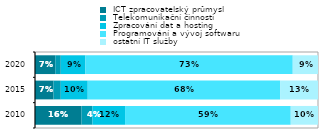
| Category |  ICT zpracovatelský průmysl |  Telekomunikační činnosti  |  Zpracování dat a hosting |  Programování a vývoj softwaru |  ostatní IT služby  |
|---|---|---|---|---|---|
| 2010.0 | 0.164 | 0.038 | 0.115 | 0.585 | 0.096 |
| 2015.0 | 0.065 | 0.026 | 0.095 | 0.68 | 0.134 |
| 2020.0 | 0.072 | 0.019 | 0.087 | 0.733 | 0.089 |